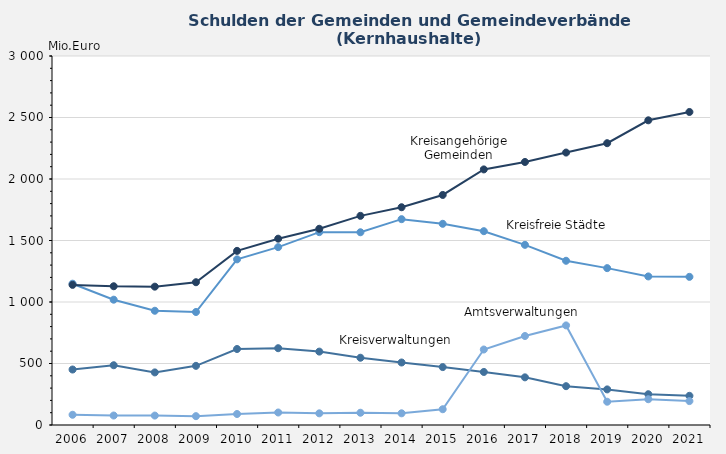
| Category | Kreisfreie Städte | Kreisverwaltungen | Kreisangehörige Gemeinden | Amtsverwaltungen |
|---|---|---|---|---|
| 2006-12-31 | 1148.685 | 450.971 | 1139.214 | 83.081 |
| 2007-12-31 | 1018.794 | 485.901 | 1128.09 | 77 |
| 2008-12-31 | 928.828 | 427.549 | 1124.734 | 76.656 |
| 2009-12-31 | 918.749 | 480.95 | 1160.738 | 71.858 |
| 2010-12-31 | 1346.654 | 617.803 | 1415.752 | 89.365 |
| 2011-12-31 | 1446.028 | 624.355 | 1514.709 | 101.622 |
| 2012-12-31 | 1567.827 | 596.621 | 1595.296 | 94.863 |
| 2013-12-31 | 1567.065 | 546.789 | 1700.382 | 99.561 |
| 2014-12-31 | 1673.41 | 508.158 | 1770.478 | 95.114 |
| 2015-12-31 | 1635.756 | 470.812 | 1870.25 | 128.185 |
| 2016-12-31 | 1575.737 | 431.207 | 2077.928 | 613.663 |
| 2017-12-31 | 1464.706 | 387.405 | 2138.452 | 723.458 |
| 2018-12-31 | 1335.215 | 315.614 | 2214.98 | 809.631 |
| 2019-12-31 | 1275.332 | 289.427 | 2291.036 | 189.311 |
| 2020-12-31 | 1207.887 | 250.246 | 2477.209 | 209.579 |
| 2021-12-31 | 1204.372 | 237.296 | 2544.894 | 194.527 |